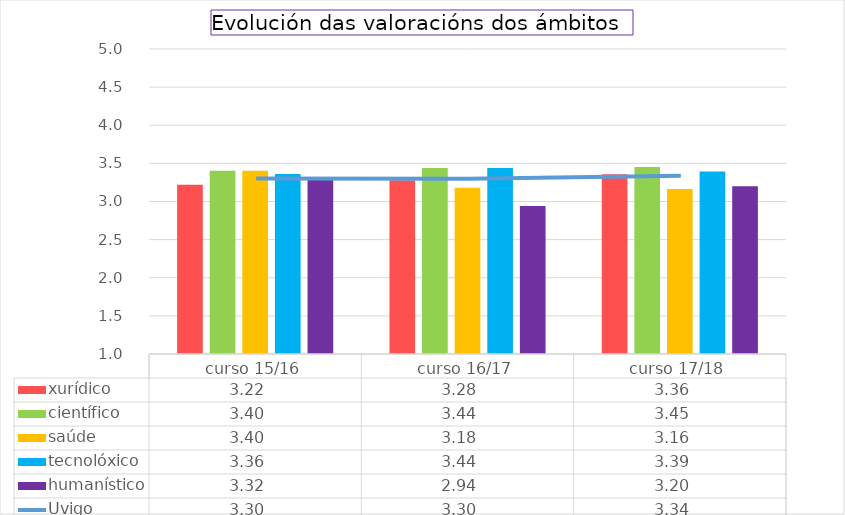
| Category | xurídico | científico | saúde | tecnolóxico | humanístico |
|---|---|---|---|---|---|
| curso 15/16 | 3.22 | 3.403 | 3.403 | 3.362 | 3.319 |
| curso 16/17 | 3.28 | 3.44 | 3.18 | 3.44 | 2.94 |
| curso 17/18 | 3.356 | 3.451 | 3.163 | 3.393 | 3.199 |